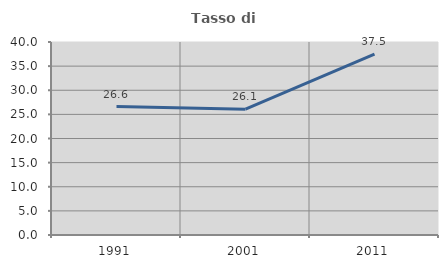
| Category | Tasso di occupazione   |
|---|---|
| 1991.0 | 26.621 |
| 2001.0 | 26.087 |
| 2011.0 | 37.5 |